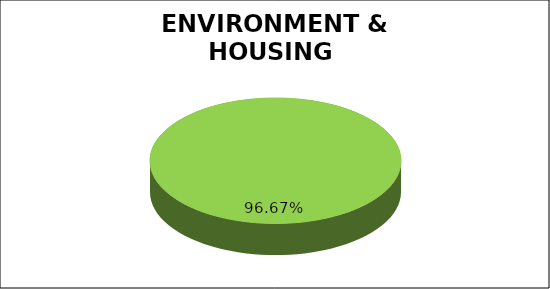
| Category | Green | Amber | Red |
|---|---|---|---|
| Q3 | 0.967 | 0 | 0.033 |